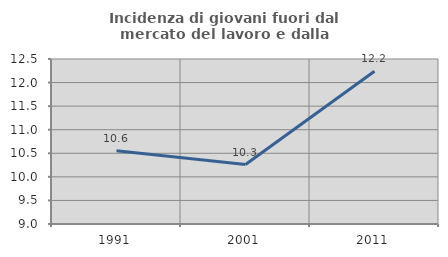
| Category | Incidenza di giovani fuori dal mercato del lavoro e dalla formazione  |
|---|---|
| 1991.0 | 10.553 |
| 2001.0 | 10.262 |
| 2011.0 | 12.24 |